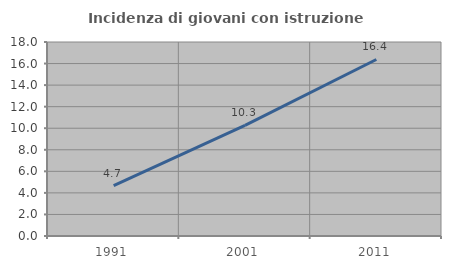
| Category | Incidenza di giovani con istruzione universitaria |
|---|---|
| 1991.0 | 4.666 |
| 2001.0 | 10.263 |
| 2011.0 | 16.378 |